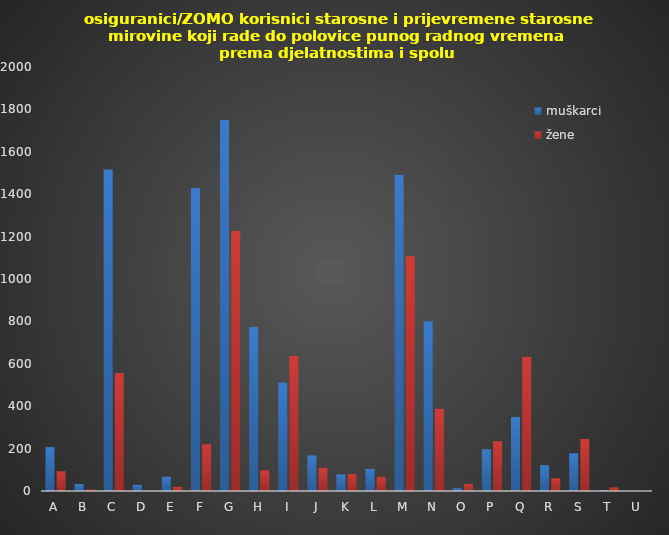
| Category | muškarci | žene |
|---|---|---|
| A | 207 | 93 |
| B | 33 | 7 |
| C | 1517 | 557 |
| D | 29 | 1 |
| E | 68 | 20 |
| F | 1429 | 220 |
| G | 1751 | 1226 |
| H | 774 | 97 |
| I | 512 | 637 |
| J | 168 | 110 |
| K | 79 | 81 |
| L | 105 | 67 |
| M | 1491 | 1107 |
| N | 801 | 388 |
| O | 13 | 33 |
| P | 197 | 235 |
| Q | 349 | 633 |
| R | 122 | 60 |
| S | 178 | 245 |
| T | 4 | 17 |
| U | 0 | 0 |